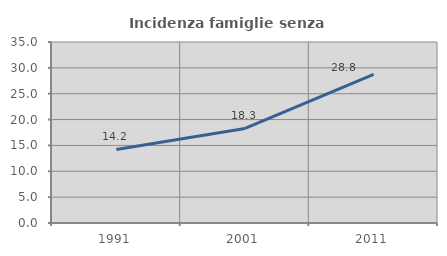
| Category | Incidenza famiglie senza nuclei |
|---|---|
| 1991.0 | 14.223 |
| 2001.0 | 18.283 |
| 2011.0 | 28.762 |